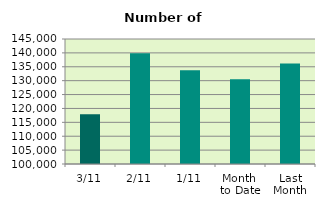
| Category | Series 0 |
|---|---|
| 3/11 | 117912 |
| 2/11 | 139850 |
| 1/11 | 133792 |
| Month 
to Date | 130518 |
| Last
Month | 136171.238 |